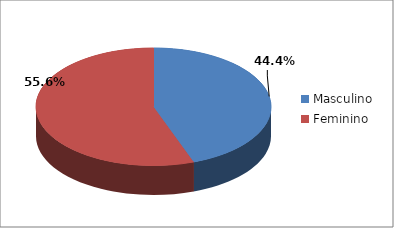
| Category | Series 0 |
|---|---|
| Masculino | 16 |
| Feminino | 20 |